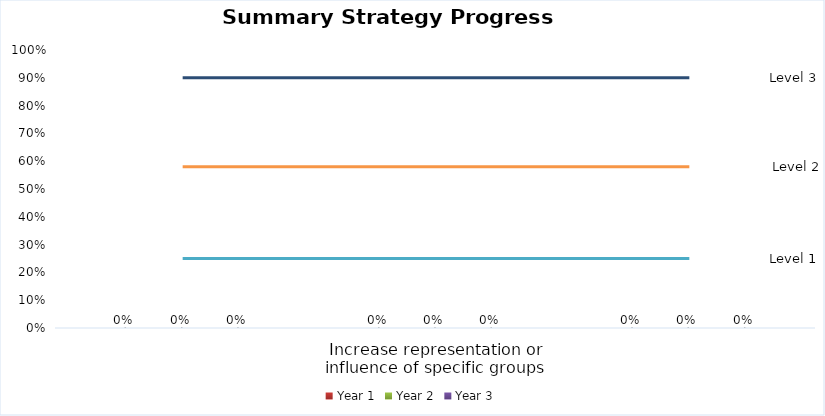
| Category | Year 1 | Year 2 | Year 3 |
|---|---|---|---|
| 0 | 0 | 0 | 0 |
| 1 | 0 | 0 | 0 |
| 2 | 0 | 0 | 0 |